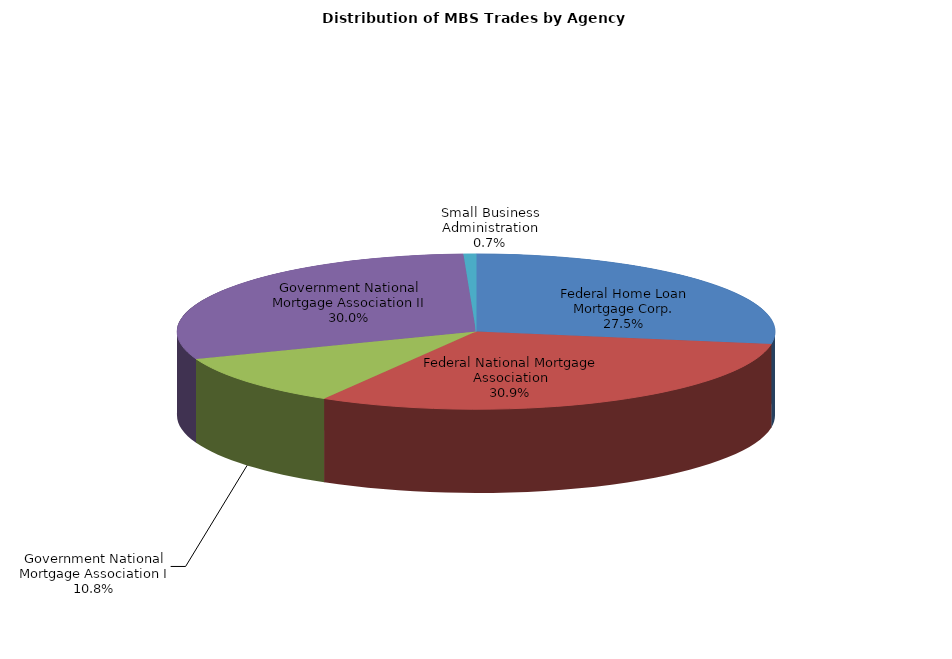
| Category | Series 0 |
|---|---|
| Federal Home Loan Mortgage Corp. | 609.984 |
| Federal National Mortgage Association | 685.429 |
| Government National Mortgage Association I | 239.71 |
| Government National Mortgage Association II | 665.73 |
| Small Business Administration | 14.901 |